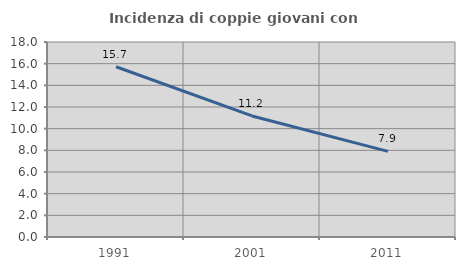
| Category | Incidenza di coppie giovani con figli |
|---|---|
| 1991.0 | 15.715 |
| 2001.0 | 11.175 |
| 2011.0 | 7.906 |